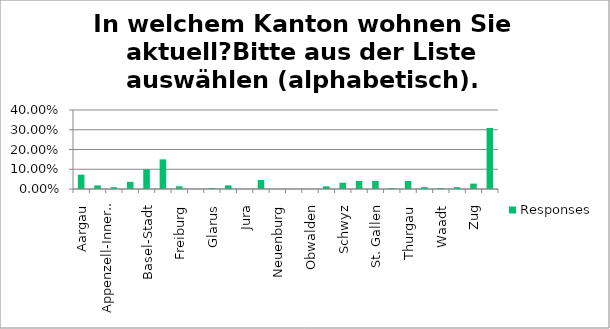
| Category | Responses |
|---|---|
| Aargau | 0.073 |
| Appenzell-Ausserrhoden | 0.018 |
| Appenzell-Innerrhoden | 0.009 |
| Basel-Landschaft | 0.036 |
| Basel-Stadt | 0.1 |
| Bern | 0.15 |
| Freiburg | 0.014 |
| Genf | 0 |
| Glarus | 0.005 |
| Graubünden | 0.018 |
| Jura | 0 |
| Luzern | 0.046 |
| Neuenburg | 0 |
| Nidwalden | 0 |
| Obwalden | 0 |
| Schaffhausen | 0.014 |
| Schwyz | 0.032 |
| Solothurn | 0.041 |
| St. Gallen | 0.041 |
| Tessin | 0.005 |
| Thurgau | 0.041 |
| Uri | 0.009 |
| Waadt | 0.005 |
| Wallis | 0.009 |
| Zug | 0.027 |
| Zürich | 0.309 |